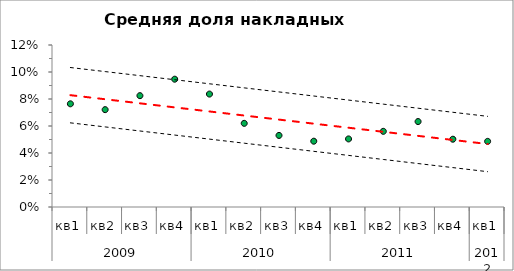
| Category | Доля накладных расходов | μ-2σ | μ | μ+2σ |
|---|---|---|---|---|
| 0 | 0.076 | 0.062 | 0.083 | 0.103 |
| 1 | 0.072 | 0.059 | 0.08 | 0.1 |
| 2 | 0.082 | 0.056 | 0.077 | 0.097 |
| 3 | 0.095 | 0.053 | 0.074 | 0.094 |
| 4 | 0.084 | 0.05 | 0.071 | 0.091 |
| 5 | 0.062 | 0.047 | 0.068 | 0.088 |
| 6 | 0.053 | 0.044 | 0.065 | 0.085 |
| 7 | 0.049 | 0.041 | 0.062 | 0.082 |
| 8 | 0.05 | 0.038 | 0.059 | 0.079 |
| 9 | 0.056 | 0.035 | 0.056 | 0.076 |
| 10 | 0.063 | 0.032 | 0.053 | 0.073 |
| 11 | 0.05 | 0.029 | 0.05 | 0.07 |
| 12 | 0.049 | 0.026 | 0.047 | 0.067 |